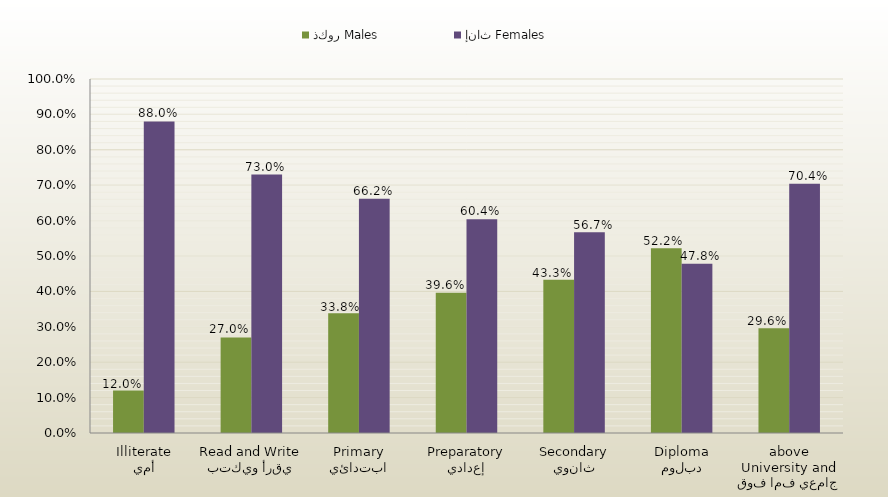
| Category | ذكور Males | إناث Females |
|---|---|---|
| أمي
Illiterate | 0.12 | 0.88 |
| يقرأ ويكتب
Read and Write | 0.27 | 0.73 |
| ابتدائي
Primary | 0.338 | 0.662 |
| إعدادي
Preparatory | 0.396 | 0.604 |
| ثانوي
Secondary | 0.433 | 0.567 |
| دبلوم
Diploma | 0.522 | 0.478 |
| جامعي فما فوق
University and above | 0.296 | 0.704 |